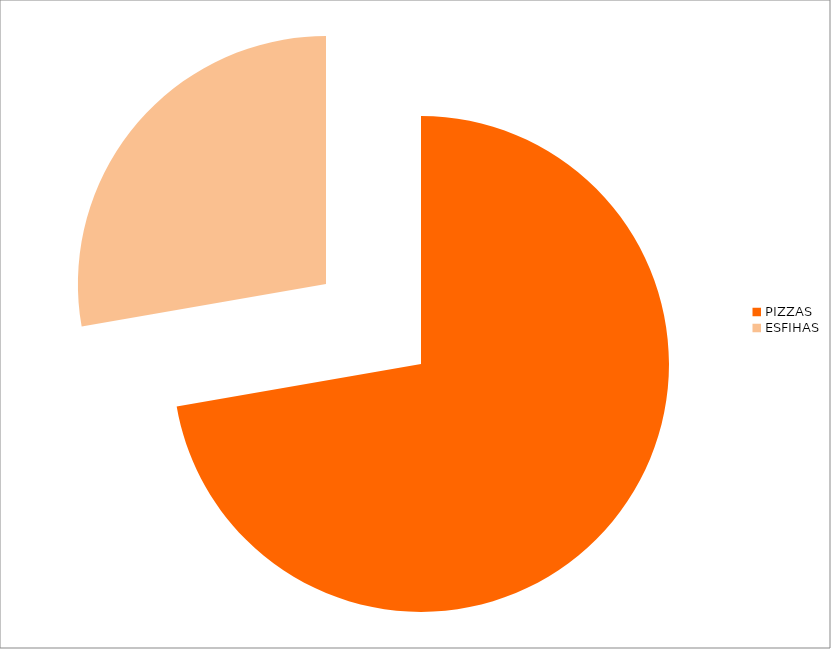
| Category | TOTAL: PIZZAS E ESFIHAS |
|---|---|
| 0 | 125 |
| 1 | 48 |